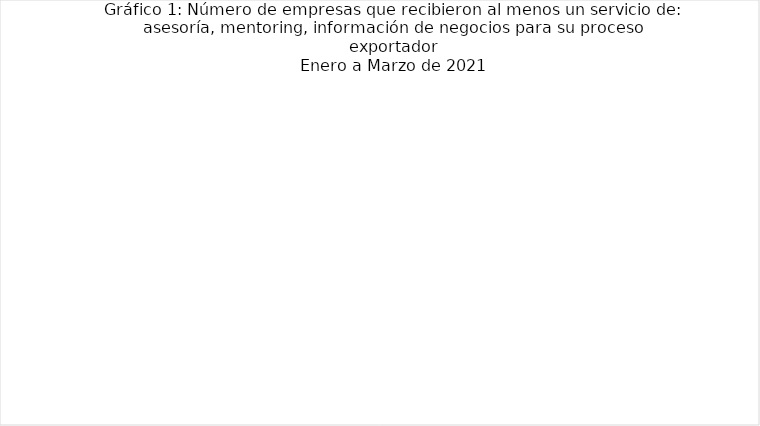
| Category | Número de empresas atendidas con servicios de: Asesoría y mentoring, contactos de negocios, plan de acción para la exportación, evaluación para la exportación  |
|---|---|
| Enero | 24 |
| Febrero | 57 |
| Marzo | 27 |